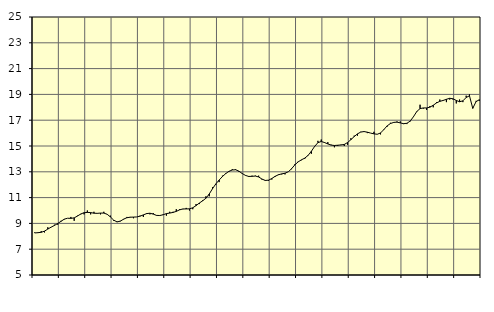
| Category | Piggar | Finansiell verksamhet, företagstjänster, SNI 64-82 |
|---|---|---|
| nan | 8.3 | 8.26 |
| 87.0 | 8.3 | 8.28 |
| 87.0 | 8.4 | 8.31 |
| 87.0 | 8.3 | 8.4 |
| nan | 8.7 | 8.56 |
| 88.0 | 8.7 | 8.71 |
| 88.0 | 8.9 | 8.84 |
| 88.0 | 8.9 | 8.99 |
| nan | 9.2 | 9.16 |
| 89.0 | 9.3 | 9.33 |
| 89.0 | 9.4 | 9.4 |
| 89.0 | 9.5 | 9.39 |
| nan | 9.2 | 9.43 |
| 90.0 | 9.6 | 9.57 |
| 90.0 | 9.7 | 9.73 |
| 90.0 | 9.7 | 9.83 |
| nan | 10 | 9.85 |
| 91.0 | 9.7 | 9.84 |
| 91.0 | 9.9 | 9.79 |
| 91.0 | 9.8 | 9.78 |
| nan | 9.7 | 9.8 |
| 92.0 | 9.9 | 9.8 |
| 92.0 | 9.7 | 9.71 |
| 92.0 | 9.6 | 9.5 |
| nan | 9.2 | 9.25 |
| 93.0 | 9.1 | 9.12 |
| 93.0 | 9.2 | 9.17 |
| 93.0 | 9.3 | 9.33 |
| nan | 9.5 | 9.44 |
| 94.0 | 9.5 | 9.48 |
| 94.0 | 9.4 | 9.49 |
| 94.0 | 9.5 | 9.5 |
| nan | 9.6 | 9.56 |
| 95.0 | 9.5 | 9.66 |
| 95.0 | 9.8 | 9.76 |
| 95.0 | 9.7 | 9.79 |
| nan | 9.8 | 9.72 |
| 96.0 | 9.6 | 9.62 |
| 96.0 | 9.6 | 9.61 |
| 96.0 | 9.7 | 9.67 |
| nan | 9.6 | 9.76 |
| 97.0 | 9.9 | 9.8 |
| 97.0 | 9.9 | 9.85 |
| 97.0 | 10.1 | 9.93 |
| nan | 10.1 | 10.05 |
| 98.0 | 10.1 | 10.12 |
| 98.0 | 10.2 | 10.12 |
| 98.0 | 10 | 10.13 |
| nan | 10.1 | 10.21 |
| 99.0 | 10.5 | 10.38 |
| 99.0 | 10.5 | 10.58 |
| 99.0 | 10.8 | 10.75 |
| nan | 11.1 | 10.95 |
| 0.0 | 11.1 | 11.28 |
| 0.0 | 11.8 | 11.69 |
| 0.0 | 12 | 12.06 |
| nan | 12.2 | 12.36 |
| 1.0 | 12.7 | 12.63 |
| 1.0 | 12.9 | 12.86 |
| 1.0 | 13 | 13.04 |
| nan | 13.2 | 13.14 |
| 2.0 | 13.2 | 13.16 |
| 2.0 | 13 | 13.05 |
| 2.0 | 12.9 | 12.87 |
| nan | 12.7 | 12.72 |
| 3.0 | 12.6 | 12.64 |
| 3.0 | 12.7 | 12.65 |
| 3.0 | 12.7 | 12.67 |
| nan | 12.7 | 12.6 |
| 4.0 | 12.4 | 12.44 |
| 4.0 | 12.3 | 12.33 |
| 4.0 | 12.3 | 12.35 |
| nan | 12.4 | 12.48 |
| 5.0 | 12.6 | 12.65 |
| 5.0 | 12.8 | 12.77 |
| 5.0 | 12.8 | 12.84 |
| nan | 12.8 | 12.89 |
| 6.0 | 13 | 13 |
| 6.0 | 13.2 | 13.24 |
| 6.0 | 13.6 | 13.54 |
| nan | 13.8 | 13.77 |
| 7.0 | 13.9 | 13.93 |
| 7.0 | 14 | 14.06 |
| 7.0 | 14.3 | 14.27 |
| nan | 14.4 | 14.59 |
| 8.0 | 15 | 14.97 |
| 8.0 | 15.4 | 15.26 |
| 8.0 | 15.5 | 15.35 |
| nan | 15.3 | 15.27 |
| 9.0 | 15.3 | 15.16 |
| 9.0 | 15.1 | 15.07 |
| 9.0 | 14.9 | 15.04 |
| nan | 15 | 15.06 |
| 10.0 | 15.1 | 15.08 |
| 10.0 | 15 | 15.12 |
| 10.0 | 15.1 | 15.27 |
| nan | 15.6 | 15.49 |
| 11.0 | 15.8 | 15.73 |
| 11.0 | 15.8 | 15.94 |
| 11.0 | 16.1 | 16.08 |
| nan | 16.1 | 16.12 |
| 12.0 | 16 | 16.07 |
| 12.0 | 16 | 16 |
| 12.0 | 16.1 | 15.94 |
| nan | 15.9 | 15.91 |
| 13.0 | 15.9 | 16.01 |
| 13.0 | 16.3 | 16.27 |
| 13.0 | 16.5 | 16.56 |
| nan | 16.8 | 16.74 |
| 14.0 | 16.8 | 16.83 |
| 14.0 | 16.9 | 16.85 |
| 14.0 | 16.9 | 16.79 |
| nan | 16.7 | 16.73 |
| 15.0 | 16.7 | 16.76 |
| 15.0 | 16.9 | 16.93 |
| 15.0 | 17.3 | 17.27 |
| nan | 17.7 | 17.67 |
| 16.0 | 18.2 | 17.9 |
| 16.0 | 17.9 | 17.95 |
| 16.0 | 17.8 | 17.95 |
| nan | 18.1 | 18.01 |
| 17.0 | 18 | 18.16 |
| 17.0 | 18.4 | 18.34 |
| 17.0 | 18.6 | 18.46 |
| nan | 18.5 | 18.53 |
| 18.0 | 18.4 | 18.62 |
| 18.0 | 18.6 | 18.7 |
| 18.0 | 18.6 | 18.66 |
| nan | 18.3 | 18.53 |
| 19.0 | 18.6 | 18.43 |
| 19.0 | 18.4 | 18.5 |
| 19.0 | 18.9 | 18.76 |
| nan | 19 | 18.89 |
| 20.0 | 18 | 17.92 |
| 20.0 | 18.5 | 18.44 |
| 20.0 | 18.5 | 18.59 |